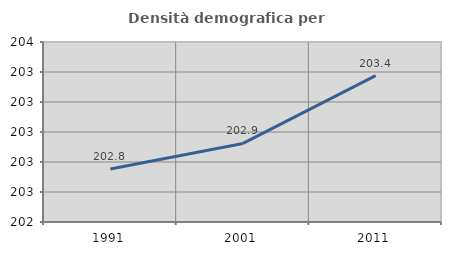
| Category | Densità demografica |
|---|---|
| 1991.0 | 202.754 |
| 2001.0 | 202.924 |
| 2011.0 | 203.376 |